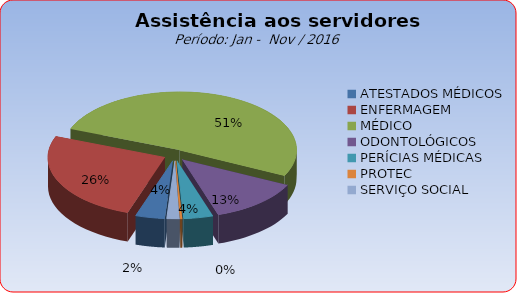
| Category | Series 0 |
|---|---|
| ATESTADOS MÉDICOS | 4.036 |
| ENFERMAGEM | 25.737 |
| MÉDICO | 51.379 |
| ODONTOLÓGICOS | 12.781 |
| PERÍCIAS MÉDICAS | 4.05 |
| PROTEC | 0.269 |
| SERVIÇO SOCIAL | 1.749 |